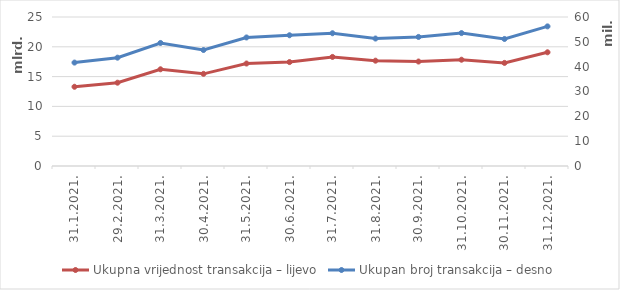
| Category | Ukupna vrijednost transakcija – lijevo |
|---|---|
| 31.1.2021. | 13295452677 |
| 29.2.2021. | 13977738320 |
| 31.3.2021. | 16226852990 |
| 30.4.2021. | 15462304741 |
| 31.5.2021. | 17193870134 |
| 30.6.2021. | 17436666779 |
| 31.7.2021. | 18301170106 |
| 31.8.2021. | 17671989151 |
| 30.9.2021. | 17528572414 |
| 31.10.2021. | 17832437986 |
| 30.11.2021. | 17297882995 |
| 31.12.2021. | 19078982671 |